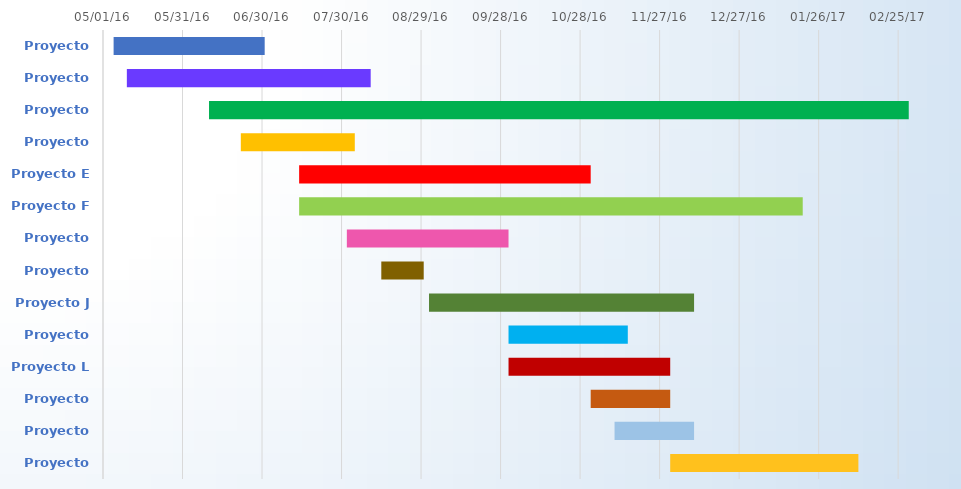
| Category | INICIO | Duration |
|---|---|---|
| Proyecto A | 2016-05-05 | 57 |
| Proyecto B | 2016-05-10 | 92 |
| Proyecto C | 2016-06-10 | 264 |
| Proyecto D | 2016-06-22 | 43 |
| Proyecto E | 2016-07-14 | 110 |
| Proyecto F | 2016-07-14 | 190 |
| Proyecto G | 2016-08-01 | 61 |
| Proyecto H | 2016-08-14 | 16 |
| Proyecto J | 2016-09-01 | 100 |
| Proyecto K | 2016-10-01 | 45 |
| Proyecto L | 2016-10-01 | 61 |
| Proyecto M | 2016-11-01 | 30 |
| Proyecto N | 2016-11-10 | 30 |
| Proyecto P | 2016-12-01 | 71 |